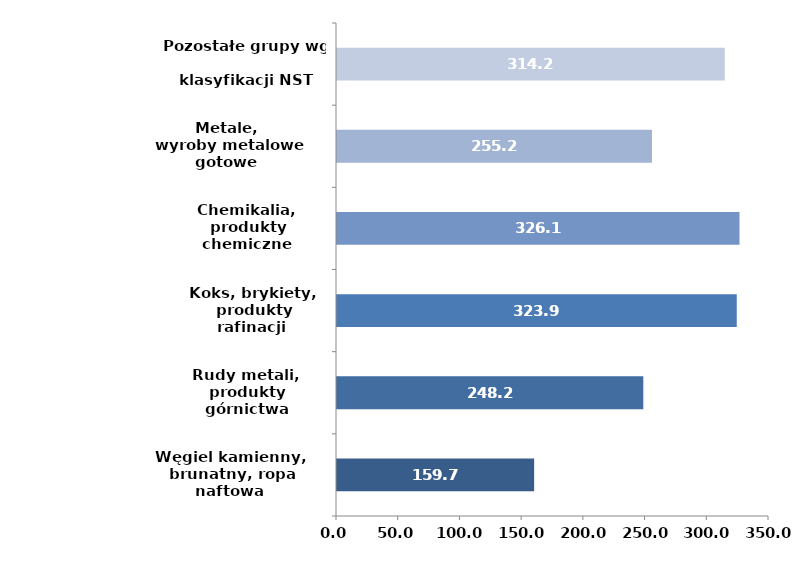
| Category | Series 0 |
|---|---|
| Węgiel kamienny,
 brunatny, ropa naftowa
 i gaz ziemny | 159.718 |
| Rudy metali, 
produkty górnictwa
 i kopalnictwa | 248.172 |
| Koks, brykiety,
 produkty rafinacji
 ropy naftowej | 323.873 |
| Chemikalia,
 produkty chemiczne | 326.097 |
| Metale,
 wyroby metalowe gotowe | 255.19 |
| Pozostałe grupy wg 
klasyfikacji NST | 314.158 |